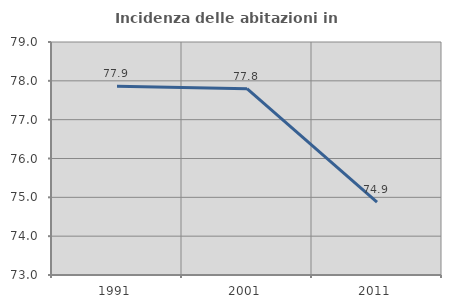
| Category | Incidenza delle abitazioni in proprietà  |
|---|---|
| 1991.0 | 77.862 |
| 2001.0 | 77.799 |
| 2011.0 | 74.878 |